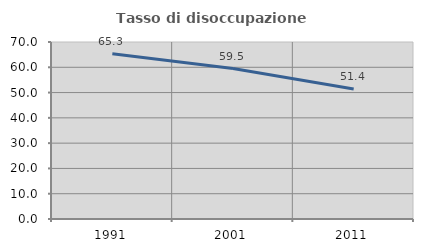
| Category | Tasso di disoccupazione giovanile  |
|---|---|
| 1991.0 | 65.315 |
| 2001.0 | 59.483 |
| 2011.0 | 51.429 |